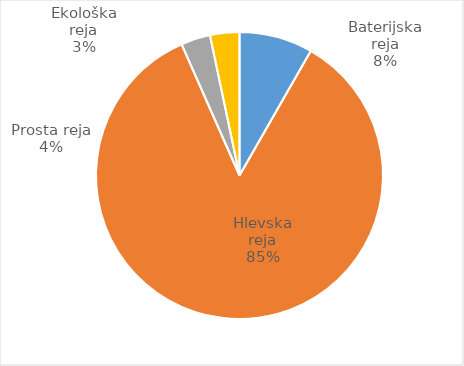
| Category | Število kosov jajc |
|---|---|
| Baterijska reja | 279684 |
| Hlevska reja | 2876459 |
| Prosta reja | 111834 |
| Ekološka reja | 111720 |